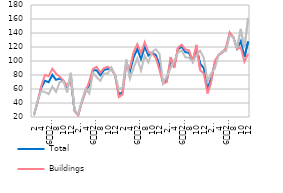
| Category | Total | Buildings  | Other construction |
|---|---|---|---|
| 2 | 22.559 | 22.725 | 22.237 |
| 3 | 41.535 | 40.825 | 42.913 |
| 4 | 61.572 | 63.952 | 56.957 |
| 5 | 71.79 | 80.04 | 55.787 |
| 6
2015 | 69.667 | 78.431 | 52.666 |
| 7 | 80.283 | 88.889 | 63.589 |
| 8 | 73.117 | 82.051 | 55.787 |
| 9 | 74.842 | 77.426 | 69.831 |
| 10 | 71.79 | 72.197 | 71.001 |
| 11 | 61.307 | 64.555 | 55.007 |
| 12 | 77.629 | 74.811 | 83.095 |
| 1
2016 | 29.459 | 28.758 | 30.819 |
| 2
 | 22.692 | 22.122 | 23.797 |
| 3 | 41.933 | 41.428 | 42.913 |
| 4 | 57.326 | 55.706 | 60.468 |
| 5 | 65.288 | 71.192 | 53.836 |
| 6
2016 | 86.785 | 88.688 | 83.095 |
| 7 | 86.653 | 91.704 | 76.853 |
| 8 | 79.62 | 83.66 | 71.782 |
| 9 | 87.316 | 89.894 | 82.315 |
| 10 | 88.51 | 91.905 | 81.925 |
| 11 | 88.909 | 87.883 | 90.897 |
| 12 | 79.62 | 79.638 | 79.584 |
| 1
2017. | 52.284 | 48.467 | 59.688 |
| 2 | 55.468 | 52.086 | 62.029 |
| 3 | 97.799 | 95.525 | 102.211 |
| 4 | 84.928 | 90.096 | 74.902 |
| 5 | 105.231 | 113.022 | 90.117 |
| 6
2017 | 117.174 | 124.082 | 103.771 |
| 7 | 102.709 | 111.212 | 86.216 |
| 8 | 120.226 | 126.898 | 107.282 |
| 9 | 107.752 | 112.821 | 97.919 |
| 10 | 111.6 | 110.809 | 113.134 |
| 11 | 108.681 | 104.575 | 116.645 |
| 12 | 95.013 | 87.079 | 110.403 |
| 1
2018 | 68.075 | 67.773 | 68.661 |
| 2
 | 72.985 | 69.985 | 78.804 |
| 3 | 100.188 | 105.782 | 89.337 |
| 4 | 93.553 | 90.096 | 100.26 |
| 5 | 116.643 | 119.055 | 111.964 |
| 6
2018 | 120.491 | 123.278 | 115.085 |
| 7 | 112.662 | 116.44 | 105.332 |
| 8 | 111.6 | 115.234 | 104.551 |
| 9 | 99.79 | 100.352 | 98.7 |
| 10 | 117.97 | 123.077 | 108.062 |
| 11 | 96.34 | 86.878 | 114.694 |
| 12 | 89.705 | 82.051 | 104.551 |
| 1
2019 | 59.715 | 53.695 | 71.391 |
| 2
 | 74.577 | 70.588 | 82.315 |
| 3 | 96.738 | 100.553 | 89.337 |
| 4 | 108.681 | 108.396 | 109.233 |
| 5 | 112.662 | 112.016 | 113.914 |
| 6
2019 | 117.174 | 118.854 | 113.914 |
| 7 | 139.3 | 141 | 136.2 |
| 8 | 133.8 | 133.7 | 133.8 |
| 9 | 117.6 | 117.2 | 118.2 |
| 10 | 128.453 | 119.457 | 145.904 |
| 11 | 105.629 | 98.944 | 118.596 |
| 12 | 127.922 | 110.608 | 161.508 |